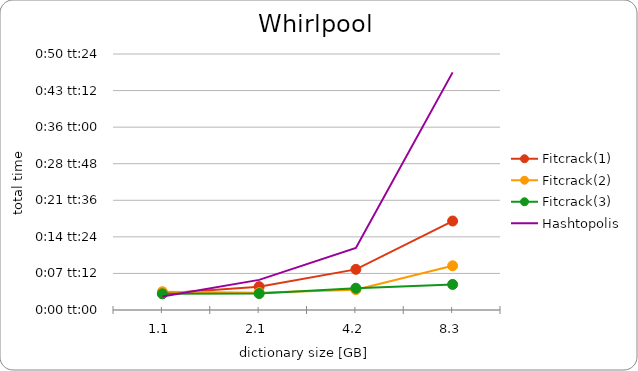
| Category | Fitcrack(1) | Fitcrack(2) | Fitcrack(3) | Hashtopolis |
|---|---|---|---|---|
| 1.1 | 0.002 | 0.002 | 0.002 | 0.002 |
| 2.1 | 0.003 | 0.002 | 0.002 | 0.004 |
| 4.2 | 0.006 | 0.003 | 0.003 | 0.008 |
| 8.3 | 0.012 | 0.006 | 0.003 | 0.032 |